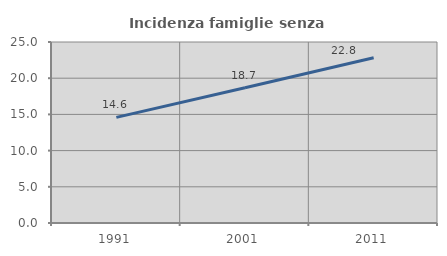
| Category | Incidenza famiglie senza nuclei |
|---|---|
| 1991.0 | 14.586 |
| 2001.0 | 18.69 |
| 2011.0 | 22.826 |